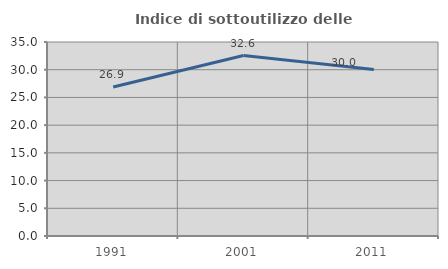
| Category | Indice di sottoutilizzo delle abitazioni  |
|---|---|
| 1991.0 | 26.894 |
| 2001.0 | 32.55 |
| 2011.0 | 30.04 |